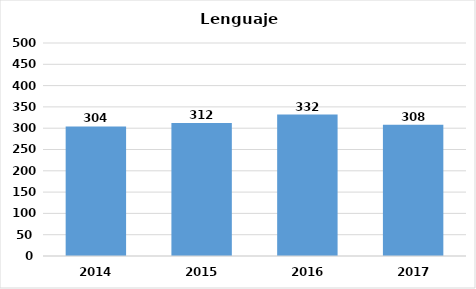
| Category | Series 0 |
|---|---|
| 2014.0 | 304 |
| 2015.0 | 312 |
| 2016.0 | 332 |
| 2017.0 | 308 |